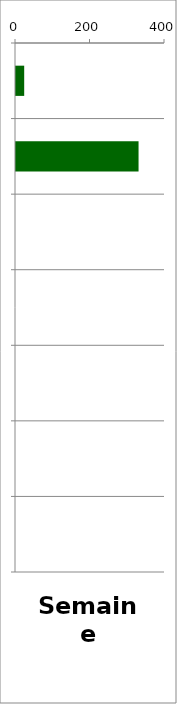
| Category | PL |
|---|---|
| 0 | 22 |
| 1 | 329 |
| 2 | 0 |
| 3 | 0 |
| 4 | 0 |
| 5 | 0 |
| 6 | 0 |